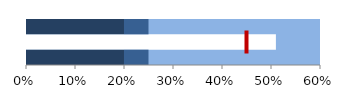
| Category | Series 0 | Series 1 | Series 2 |
|---|---|---|---|
| 2.0 | 0 | 0.2 | 0.05 |